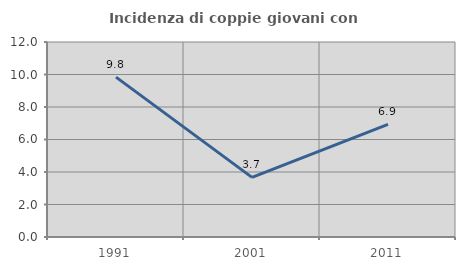
| Category | Incidenza di coppie giovani con figli |
|---|---|
| 1991.0 | 9.836 |
| 2001.0 | 3.67 |
| 2011.0 | 6.931 |